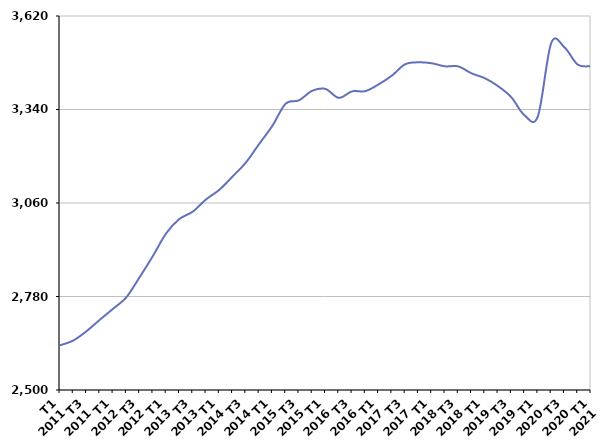
| Category | De 25 à 49 ans |
|---|---|
| T1
2011 | 2633.9 |
| T2
2011 | 2648.2 |
| T3
2011 | 2676.2 |
| T4
2011 | 2710.4 |
| T1
2012 | 2743.3 |
| T2
2012 | 2777.7 |
| T3
2012 | 2838 |
| T4
2012 | 2901.4 |
| T1
2013 | 2969.4 |
| T2
2013 | 3012.3 |
| T3
2013 | 3034 |
| T4
2013 | 3070.7 |
| T1
2014 | 3099.4 |
| T2
2014 | 3139.3 |
| T3
2014 | 3181.1 |
| T4
2014 | 3236.7 |
| T1
2015 | 3291.3 |
| T2
2015 | 3357.5 |
| T3
2015 | 3367.4 |
| T4
2015 | 3396 |
| T1
2016 | 3401.6 |
| T2
2016 | 3374.9 |
| T3
2016 | 3394.3 |
| T4
2016 | 3395 |
| T1
2017 | 3415.3 |
| T2
2017 | 3441.4 |
| T3
2017 | 3475.4 |
| T4
2017 | 3481.3 |
| T1
2018 | 3478.5 |
| T2
2018 | 3469.3 |
| T3
2018 | 3469.1 |
| T4
2018 | 3448.3 |
| T1
2019 | 3433.8 |
| T2
2019 | 3409.8 |
| T3
2019 | 3376.6 |
| T4
2019 | 3322.3 |
| T1
2020 | 3319.8 |
| T2
2020 | 3538.6 |
| T3
2020 | 3526.2 |
| T4
2020 | 3474.4 |
| T1
2021 | 3469.8 |